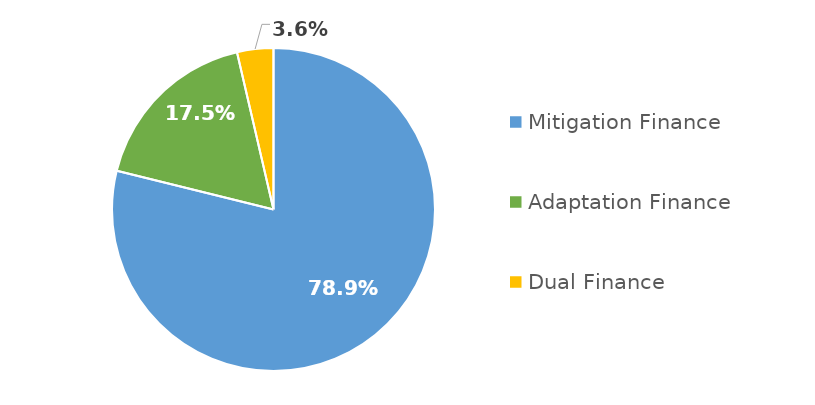
| Category | Series 0 |
|---|---|
| 0 | 3428834659.543 |
| 1 | 760967656.116 |
| 2 | 157881815 |